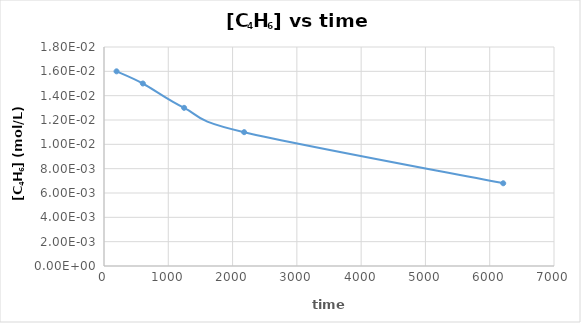
| Category | [C4H6] (mol/L) |
|---|---|
| 195.0 | 0.016 |
| 604.0 | 0.015 |
| 1246.0 | 0.013 |
| 2180.0 | 0.011 |
| 6210.0 | 0.007 |